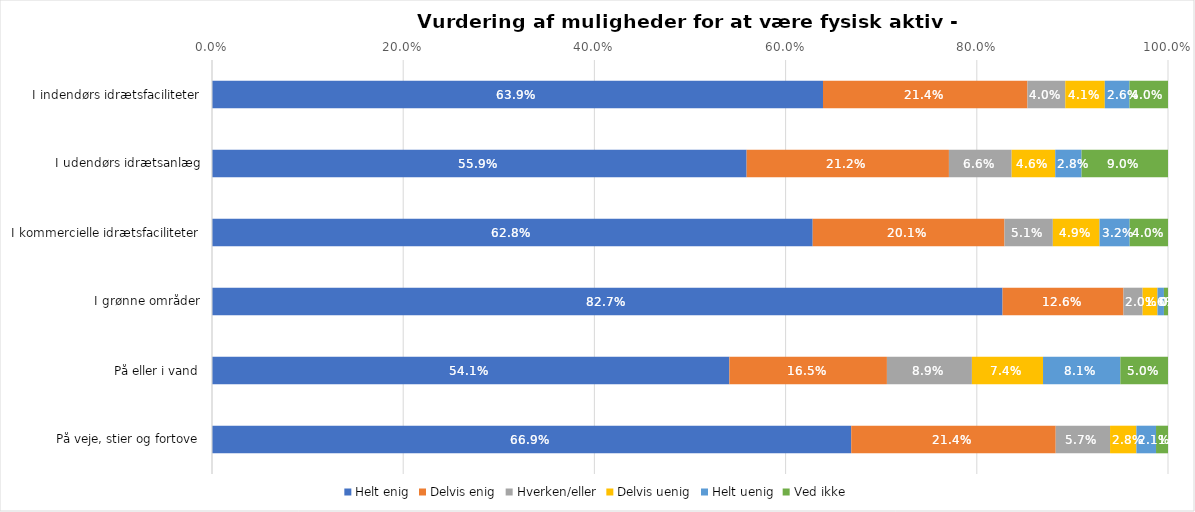
| Category | Helt enig | Delvis enig | Hverken/eller | Delvis uenig | Helt uenig | Ved ikke |
|---|---|---|---|---|---|---|
| I indendørs idrætsfaciliteter | 0.639 | 0.214 | 0.04 | 0.041 | 0.026 | 0.04 |
| I udendørs idrætsanlæg | 0.559 | 0.212 | 0.066 | 0.046 | 0.028 | 0.09 |
| I kommercielle idrætsfaciliteter | 0.628 | 0.201 | 0.051 | 0.049 | 0.032 | 0.04 |
| I grønne områder | 0.827 | 0.126 | 0.02 | 0.016 | 0.007 | 0.004 |
| På eller i vand | 0.541 | 0.165 | 0.089 | 0.074 | 0.081 | 0.05 |
| På veje, stier og fortove | 0.669 | 0.214 | 0.057 | 0.028 | 0.021 | 0.013 |